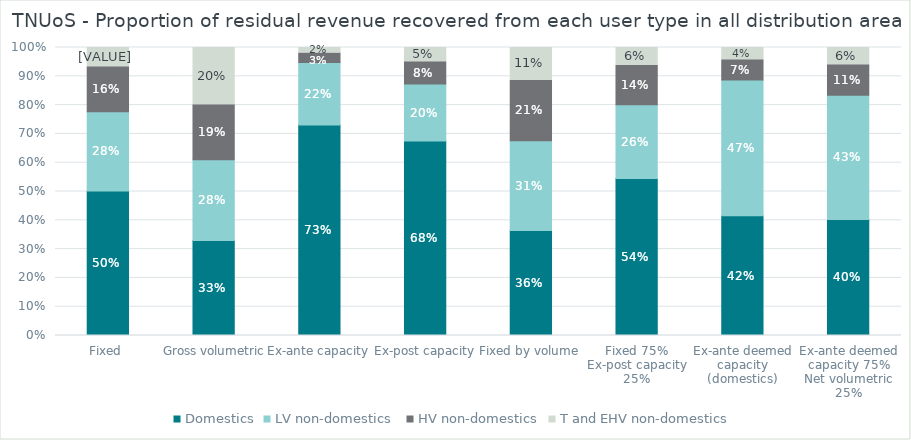
| Category | Domestics | LV non-domestics  | HV non-domestics | T and EHV non-domestics |
|---|---|---|---|---|
| Fixed | 0.502 | 0.276 | 0.156 | 0.067 |
| Gross volumetric | 0.33 | 0.281 | 0.19 | 0.199 |
| Ex-ante capacity | 0.731 | 0.217 | 0.033 | 0.019 |
| Ex-post capacity | 0.675 | 0.198 | 0.077 | 0.05 |
| Fixed by volume  | 0.365 | 0.311 | 0.211 | 0.113 |
| Fixed 75%
Ex-post capacity 25% | 0.545 | 0.256 | 0.136 | 0.063 |
| Ex-ante deemed capacity (domestics) | 0.415 | 0.471 | 0.071 | 0.042 |
| Ex-ante deemed capacity 75%
Net volumetric 25% | 0.403 | 0.431 | 0.106 | 0.06 |